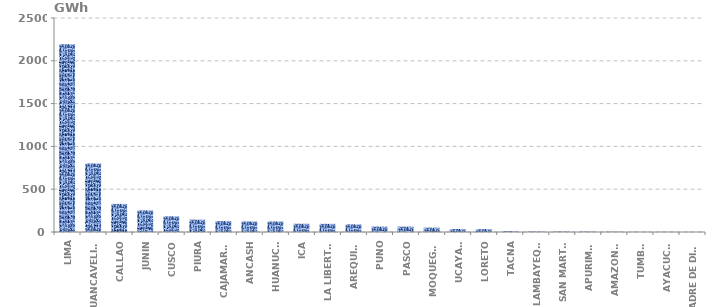
| Category | Series 0 |
|---|---|
| LIMA | 2194.482 |
| HUANCAVELICA | 801.43 |
| CALLAO | 327.913 |
| JUNIN | 252.285 |
| CUSCO | 182.807 |
| PIURA | 143.958 |
| CAJAMARCA | 127.482 |
| ANCASH | 123.058 |
| HUANUCO | 122.971 |
| ICA | 96.39 |
| LA LIBERTAD | 95.21 |
| AREQUIPA | 88.936 |
| PUNO | 63.229 |
| PASCO | 62.895 |
| MOQUEGUA | 51.32 |
| UCAYALI | 35.388 |
| LORETO | 34.096 |
| TACNA | 10.213 |
| LAMBAYEQUE | 5.083 |
| SAN MARTÍN | 4.996 |
| APURIMAC | 4.352 |
| AMAZONAS | 3.106 |
| TUMBES | 1.101 |
| AYACUCHO | 0.908 |
| MADRE DE DIOS | 0.097 |